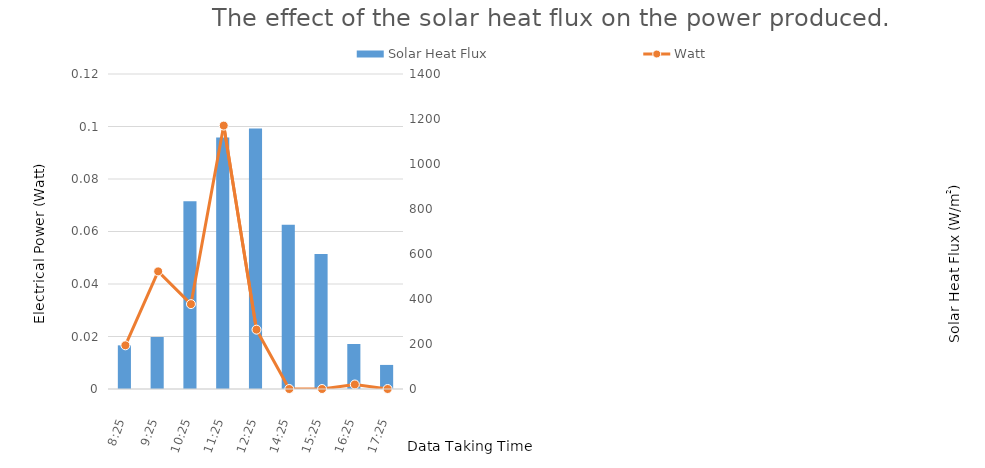
| Category | Solar Heat Flux |
|---|---|
| 261408.35069444444 | 194 |
| 784224.3923611114 | 231 |
| 1307040.4340277782 | 834 |
| 1829856.4756944452 | 1118 |
| 2352672.517361111 | 1158 |
| 1307040.600694445 | 730 |
| 1829856.642361112 | 600 |
| 2352672.6840277775 | 200 |
| 2875488.7256944417 | 107 |